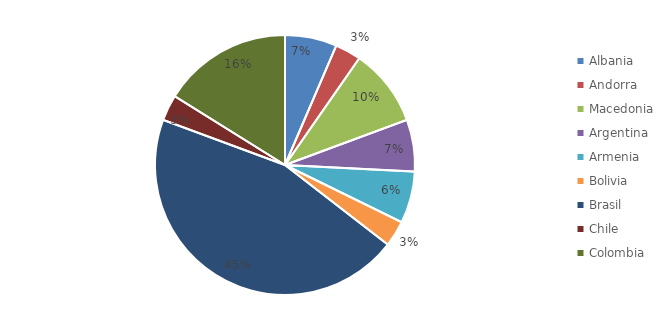
| Category | Series 0 |
|---|---|
| Albania | 2 |
| Andorra | 1 |
| Macedonia | 3 |
| Argentina | 2 |
| Armenia | 2 |
| Bolivia | 1 |
| Brasil | 14 |
| Chile | 1 |
| Colombia | 5 |